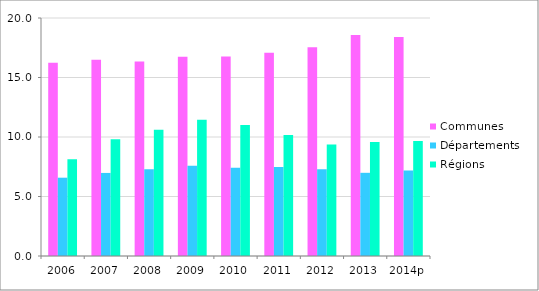
| Category | Communes | Départements  | Régions |
|---|---|---|---|
| 2006 | 16.25 | 6.58 | 8.14 |
| 2007 | 16.5 | 6.98 | 9.82 |
| 2008 | 16.34 | 7.3 | 10.61 |
| 2009 | 16.75 | 7.59 | 11.46 |
| 2010 | 16.76 | 7.42 | 11.01 |
| 2011 | 17.09 | 7.48 | 10.17 |
| 2012 | 17.55 | 7.3 | 9.38 |
| 2013 | 18.57 | 6.99 | 9.57 |
| 2014p | 18.4 | 7.18 | 9.66 |